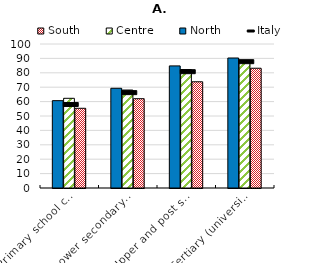
| Category | North | Centre | South |
|---|---|---|---|
| Primary school certificate, no educational degree | 60.664 | 62.293 | 55.356 |
| Lower secondary school certificate | 69.252 | 68.03 | 62.019 |
| Upper and post secondary | 84.793 | 82.231 | 73.768 |
| Tertiary (university, doctoral and specialization courses) | 90.276 | 87.879 | 83.164 |